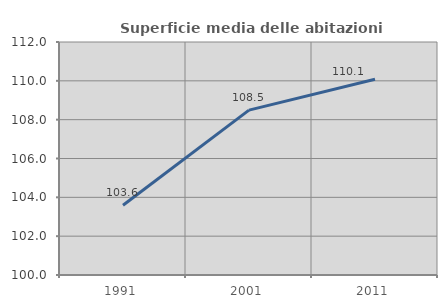
| Category | Superficie media delle abitazioni occupate |
|---|---|
| 1991.0 | 103.589 |
| 2001.0 | 108.492 |
| 2011.0 | 110.08 |